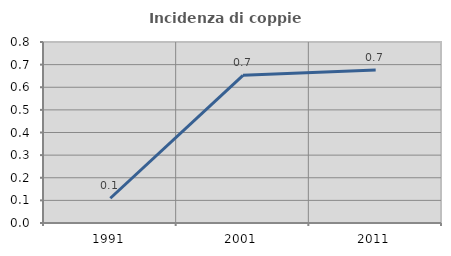
| Category | Incidenza di coppie miste |
|---|---|
| 1991.0 | 0.109 |
| 2001.0 | 0.653 |
| 2011.0 | 0.676 |